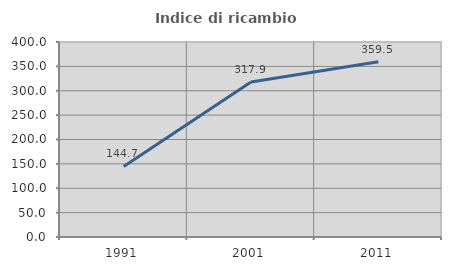
| Category | Indice di ricambio occupazionale  |
|---|---|
| 1991.0 | 144.681 |
| 2001.0 | 317.857 |
| 2011.0 | 359.459 |